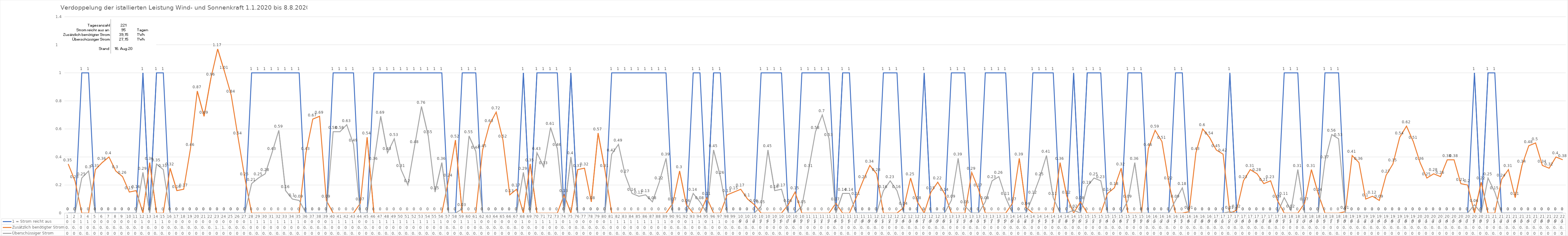
| Category | 1 = Strom reicht aus | Zusätzlich benötigter Strom | Überschüssiger Strom |
|---|---|---|---|
| 0 | 0 | 0.35 | 0 |
| 1 | 0 | 0.23 | 0 |
| 2 | 1 | 0 | 0.25 |
| 3 | 1 | 0 | 0.3 |
| 4 | 0 | 0.31 | 0 |
| 5 | 0 | 0.36 | 0 |
| 6 | 0 | 0.4 | 0 |
| 7 | 0 | 0.3 | 0 |
| 8 | 0 | 0.26 | 0 |
| 9 | 0 | 0.15 | 0 |
| 10 | 0 | 0.16 | 0 |
| 11 | 1 | 0 | 0.29 |
| 12 | 0 | 0.36 | 0 |
| 13 | 1 | 0 | 0.35 |
| 14 | 1 | 0 | 0.31 |
| 15 | 0 | 0.32 | 0 |
| 16 | 0 | 0.16 | 0 |
| 17 | 0 | 0.17 | 0 |
| 18 | 0 | 0.46 | 0 |
| 19 | 0 | 0.87 | 0 |
| 20 | 0 | 0.69 | 0 |
| 21 | 0 | 0.96 | 0 |
| 22 | 0 | 1.17 | 0 |
| 23 | 0 | 1.01 | 0 |
| 24 | 0 | 0.84 | 0 |
| 25 | 0 | 0.54 | 0 |
| 26 | 0 | 0.25 | 0 |
| 27 | 1 | 0 | 0.21 |
| 28 | 1 | 0 | 0.25 |
| 29 | 1 | 0 | 0.28 |
| 30 | 1 | 0 | 0.43 |
| 31 | 1 | 0 | 0.59 |
| 32 | 1 | 0 | 0.16 |
| 33 | 1 | 0 | 0.1 |
| 34 | 1 | 0 | 0.09 |
| 35 | 0 | 0.43 | 0 |
| 36 | 0 | 0.67 | 0 |
| 37 | 0 | 0.69 | 0 |
| 38 | 0 | 0.09 | 0 |
| 39 | 1 | 0 | 0.58 |
| 40 | 1 | 0 | 0.58 |
| 41 | 1 | 0 | 0.63 |
| 42 | 1 | 0 | 0.49 |
| 43 | 0 | 0.07 | 0 |
| 44 | 0 | 0.54 | 0 |
| 45 | 1 | 0 | 0.36 |
| 46 | 1 | 0 | 0.69 |
| 47 | 1 | 0 | 0.43 |
| 48 | 1 | 0 | 0.53 |
| 49 | 1 | 0 | 0.31 |
| 50 | 1 | 0 | 0.2 |
| 51 | 1 | 0 | 0.48 |
| 52 | 1 | 0 | 0.76 |
| 53 | 1 | 0 | 0.55 |
| 54 | 1 | 0 | 0.15 |
| 55 | 1 | 0 | 0.36 |
| 56 | 0 | 0.24 | 0 |
| 57 | 0 | 0.52 | 0 |
| 58 | 1 | 0 | 0.03 |
| 59 | 1 | 0 | 0.55 |
| 60 | 1 | 0 | 0.44 |
| 61 | 0 | 0.45 | 0 |
| 62 | 0 | 0.63 | 0 |
| 63 | 0 | 0.72 | 0 |
| 64 | 0 | 0.52 | 0 |
| 65 | 0 | 0.13 | 0 |
| 66 | 0 | 0.17 | 0 |
| 67 | 1 | 0 | 0.29 |
| 68 | 0 | 0.35 | 0 |
| 69 | 1 | 0 | 0.43 |
| 70 | 1 | 0 | 0.33 |
| 71 | 1 | 0 | 0.61 |
| 72 | 1 | 0 | 0.46 |
| 73 | 0 | 0.13 | 0 |
| 74 | 1 | 0 | 0.4 |
| 75 | 0 | 0.31 | 0 |
| 76 | 0 | 0.32 | 0 |
| 77 | 0 | 0.08 | 0 |
| 78 | 0 | 0.57 | 0 |
| 79 | 0 | 0.31 | 0 |
| 80 | 1 | 0 | 0.42 |
| 81 | 1 | 0 | 0.49 |
| 82 | 1 | 0 | 0.27 |
| 83 | 1 | 0 | 0.14 |
| 84 | 1 | 0 | 0.12 |
| 85 | 1 | 0 | 0.13 |
| 86 | 1 | 0 | 0.08 |
| 87 | 1 | 0 | 0.22 |
| 88 | 1 | 0 | 0.39 |
| 89 | 0 | 0.07 | 0 |
| 90 | 0 | 0.3 | 0 |
| 91 | 0 | 0.06 | 0 |
| 92 | 1 | 0 | 0.14 |
| 93 | 1 | 0 | 0.08 |
| 94 | 0 | 0.11 | 0 |
| 95 | 1 | 0 | 0.45 |
| 96 | 1 | 0 | 0.26 |
| 97 | 0 | 0.13 | 0 |
| 98 | 0 | 0.15 | 0 |
| 99 | 0 | 0.17 | 0 |
| 100 | 0 | 0.1 | 0 |
| 101 | 0 | 0.06 | 0 |
| 102 | 1 | 0 | 0.05 |
| 103 | 1 | 0 | 0.45 |
| 104 | 1 | 0 | 0.16 |
| 105 | 1 | 0 | 0.17 |
| 106 | 0 | 0.06 | 0 |
| 107 | 0 | 0.15 | 0 |
| 108 | 1 | 0 | 0.05 |
| 109 | 1 | 0 | 0.31 |
| 110 | 1 | 0 | 0.58 |
| 111 | 1 | 0 | 0.7 |
| 112 | 1 | 0 | 0.53 |
| 113 | 0 | 0.07 | 0 |
| 114 | 1 | 0 | 0.14 |
| 115 | 1 | 0 | 0.14 |
| 116 | 0 | 0.11 | 0 |
| 117 | 0 | 0.23 | 0 |
| 118 | 0 | 0.34 | 0 |
| 119 | 0 | 0.28 | 0 |
| 120 | 1 | 0 | 0.16 |
| 121 | 1 | 0 | 0.23 |
| 122 | 1 | 0 | 0.16 |
| 123 | 0 | 0.04 | 0 |
| 124 | 0 | 0.25 | 0 |
| 125 | 0 | 0.08 | 0 |
| 126 | 1 | 0 | 0 |
| 127 | 0 | 0.15 | 0 |
| 128 | 0 | 0.22 | 0 |
| 129 | 0 | 0.14 | 0 |
| 130 | 1 | 0 | 0.09 |
| 131 | 1 | 0 | 0.39 |
| 132 | 1 | 0 | 0.05 |
| 133 | 0 | 0.29 | 0 |
| 134 | 0 | 0.17 | 0 |
| 135 | 1 | 0 | 0.08 |
| 136 | 1 | 0 | 0.23 |
| 137 | 1 | 0 | 0.26 |
| 138 | 1 | 0 | 0.11 |
| 139 | 0 | 0.07 | 0 |
| 140 | 0 | 0.39 | 0 |
| 141 | 0 | 0.04 | 0 |
| 142 | 1 | 0 | 0.12 |
| 143 | 1 | 0 | 0.25 |
| 144 | 1 | 0 | 0.41 |
| 145 | 1 | 0 | 0.11 |
| 146 | 0 | 0.36 | 0 |
| 147 | 0 | 0.12 | 0 |
| 148 | 1 | 0 | 0.02 |
| 149 | 0 | 0.08 | 0 |
| 150 | 1 | 0 | 0.19 |
| 151 | 1 | 0 | 0.25 |
| 152 | 1 | 0 | 0.23 |
| 153 | 0 | 0.14 | 0 |
| 154 | 0 | 0.18 | 0 |
| 155 | 0 | 0.32 | 0 |
| 156 | 1 | 0 | 0.09 |
| 157 | 1 | 0 | 0.36 |
| 158 | 1 | 0 | 0 |
| 159 | 0 | 0.46 | 0 |
| 160 | 0 | 0.59 | 0 |
| 161 | 0 | 0.51 | 0 |
| 162 | 0 | 0.22 | 0 |
| 163 | 1 | 0 | 0.09 |
| 164 | 1 | 0 | 0.18 |
| 165 | 0 | 0.01 | 0 |
| 166 | 0 | 0.43 | 0 |
| 167 | 0 | 0.6 | 0 |
| 168 | 0 | 0.54 | 0 |
| 169 | 0 | 0.45 | 0 |
| 170 | 0 | 0.42 | 0 |
| 171 | 1 | 0 | 0.01 |
| 172 | 0 | 0.02 | 0 |
| 173 | 0 | 0.23 | 0 |
| 174 | 0 | 0.31 | 0 |
| 175 | 0 | 0.28 | 0 |
| 176 | 0 | 0.21 | 0 |
| 177 | 0 | 0.23 | 0 |
| 178 | 0 | 0.09 | 0 |
| 179 | 1 | 0 | 0.11 |
| 180 | 1 | 0 | 0.02 |
| 181 | 1 | 0 | 0.31 |
| 182 | 0 | 0.07 | 0 |
| 183 | 0 | 0.31 | 0 |
| 184 | 0 | 0.14 | 0 |
| 185 | 1 | 0 | 0.37 |
| 186 | 1 | 0 | 0.56 |
| 187 | 1 | 0 | 0.53 |
| 188 | 0 | 0.01 | 0 |
| 189 | 0 | 0.41 | 0 |
| 190 | 0 | 0.36 | 0 |
| 191 | 0 | 0.1 | 0 |
| 192 | 0 | 0.12 | 0 |
| 193 | 0 | 0.09 | 0 |
| 194 | 0 | 0.27 | 0 |
| 195 | 0 | 0.35 | 0 |
| 196 | 0 | 0.54 | 0 |
| 197 | 0 | 0.62 | 0 |
| 198 | 0 | 0.51 | 0 |
| 199 | 0 | 0.36 | 0 |
| 200 | 0 | 0.25 | 0 |
| 201 | 0 | 0.28 | 0 |
| 202 | 0 | 0.26 | 0 |
| 203 | 0 | 0.38 | 0 |
| 204 | 0 | 0.38 | 0 |
| 205 | 0 | 0.21 | 0 |
| 206 | 0 | 0.2 | 0 |
| 207 | 1 | 0 | 0.06 |
| 208 | 0 | 0.22 | 0 |
| 209 | 1 | 0 | 0.25 |
| 210 | 1 | 0 | 0.15 |
| 211 | 0 | 0.24 | 0 |
| 212 | 0 | 0.31 | 0 |
| 213 | 0 | 0.11 | 0 |
| 214 | 0 | 0.34 | 0 |
| 215 | 0 | 0.48 | 0 |
| 216 | 0 | 0.5 | 0 |
| 217 | 0 | 0.34 | 0 |
| 218 | 0 | 0.32 | 0 |
| 219 | 0 | 0.4 | 0 |
| 220 | 0 | 0.38 | 0 |